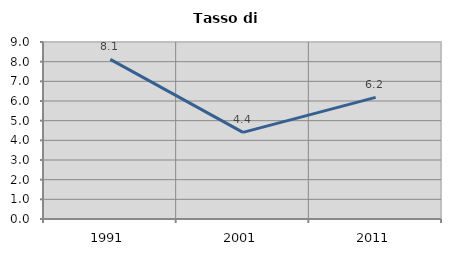
| Category | Tasso di disoccupazione   |
|---|---|
| 1991.0 | 8.118 |
| 2001.0 | 4.407 |
| 2011.0 | 6.186 |